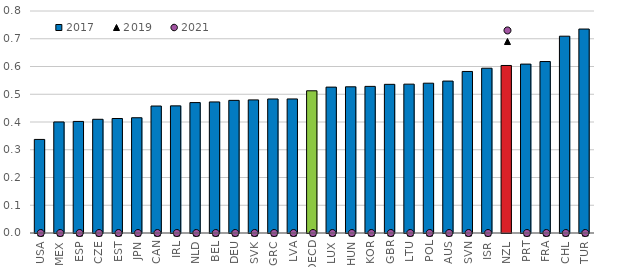
| Category | 2017 |
|---|---|
| USA | 0.337 |
| MEX | 0.4 |
| ESP | 0.402 |
| CZE | 0.41 |
| EST | 0.413 |
| JPN | 0.415 |
| CAN | 0.458 |
| IRL | 0.458 |
| NLD | 0.47 |
| BEL | 0.472 |
| DEU | 0.478 |
| SVK | 0.48 |
| GRC | 0.483 |
| LVA | 0.483 |
| OECD | 0.512 |
| LUX | 0.526 |
| HUN | 0.527 |
| KOR | 0.528 |
| GBR | 0.536 |
| LTU | 0.536 |
| POL | 0.54 |
| AUS | 0.547 |
| SVN | 0.582 |
| ISR | 0.594 |
| NZL | 0.604 |
| PRT | 0.609 |
| FRA | 0.618 |
| CHL | 0.709 |
| TUR | 0.735 |